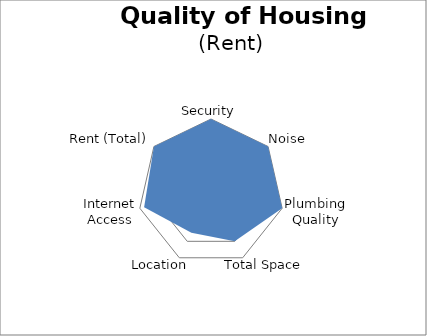
| Category | Rental Ranking |
|---|---|
| Security | 100 |
| Noise | 100 |
| Plumbing Quality | 100 |
| Total Space | 74.842 |
| Location | 61.878 |
| Internet Access | 93.962 |
| Rent (Total) | 100 |